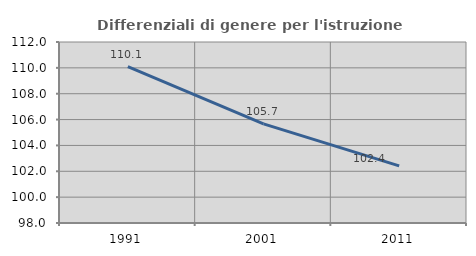
| Category | Differenziali di genere per l'istruzione superiore |
|---|---|
| 1991.0 | 110.1 |
| 2001.0 | 105.667 |
| 2011.0 | 102.422 |